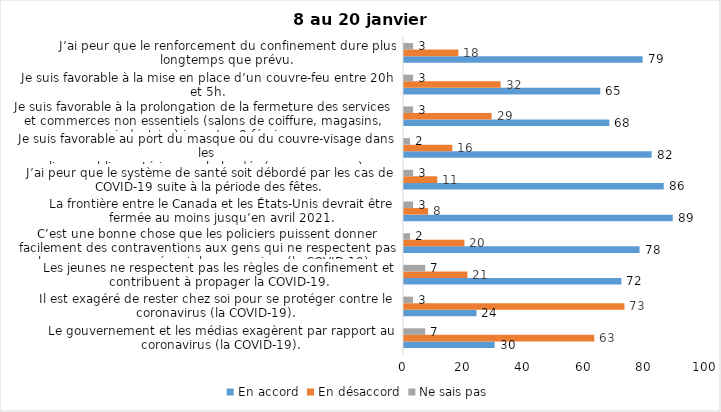
| Category | En accord | En désaccord | Ne sais pas |
|---|---|---|---|
| Le gouvernement et les médias exagèrent par rapport au coronavirus (la COVID-19). | 30 | 63 | 7 |
| Il est exagéré de rester chez soi pour se protéger contre le coronavirus (la COVID-19). | 24 | 73 | 3 |
| Les jeunes ne respectent pas les règles de confinement et contribuent à propager la COVID-19. | 72 | 21 | 7 |
| C’est une bonne chose que les policiers puissent donner facilement des contraventions aux gens qui ne respectent pas les mesures pour prévenir le coronavirus (la COVID-19). | 78 | 20 | 2 |
| La frontière entre le Canada et les États-Unis devrait être fermée au moins jusqu’en avril 2021. | 89 | 8 | 3 |
| J’ai peur que le système de santé soit débordé par les cas de COVID-19 suite à la période des fêtes. | 86 | 11 | 3 |
| Je suis favorable au port du masque ou du couvre-visage dans les
lieux publics extérieurs achalandés (ex. rues, parcs) | 82 | 16 | 2 |
| Je suis favorable à la prolongation de la fermeture des services et commerces non essentiels (salons de coiffure, magasins, industries) jusqu’au 8 février. | 68 | 29 | 3 |
| Je suis favorable à la mise en place d’un couvre-feu entre 20h et 5h. | 65 | 32 | 3 |
| J’ai peur que le renforcement du confinement dure plus longtemps que prévu. | 79 | 18 | 3 |